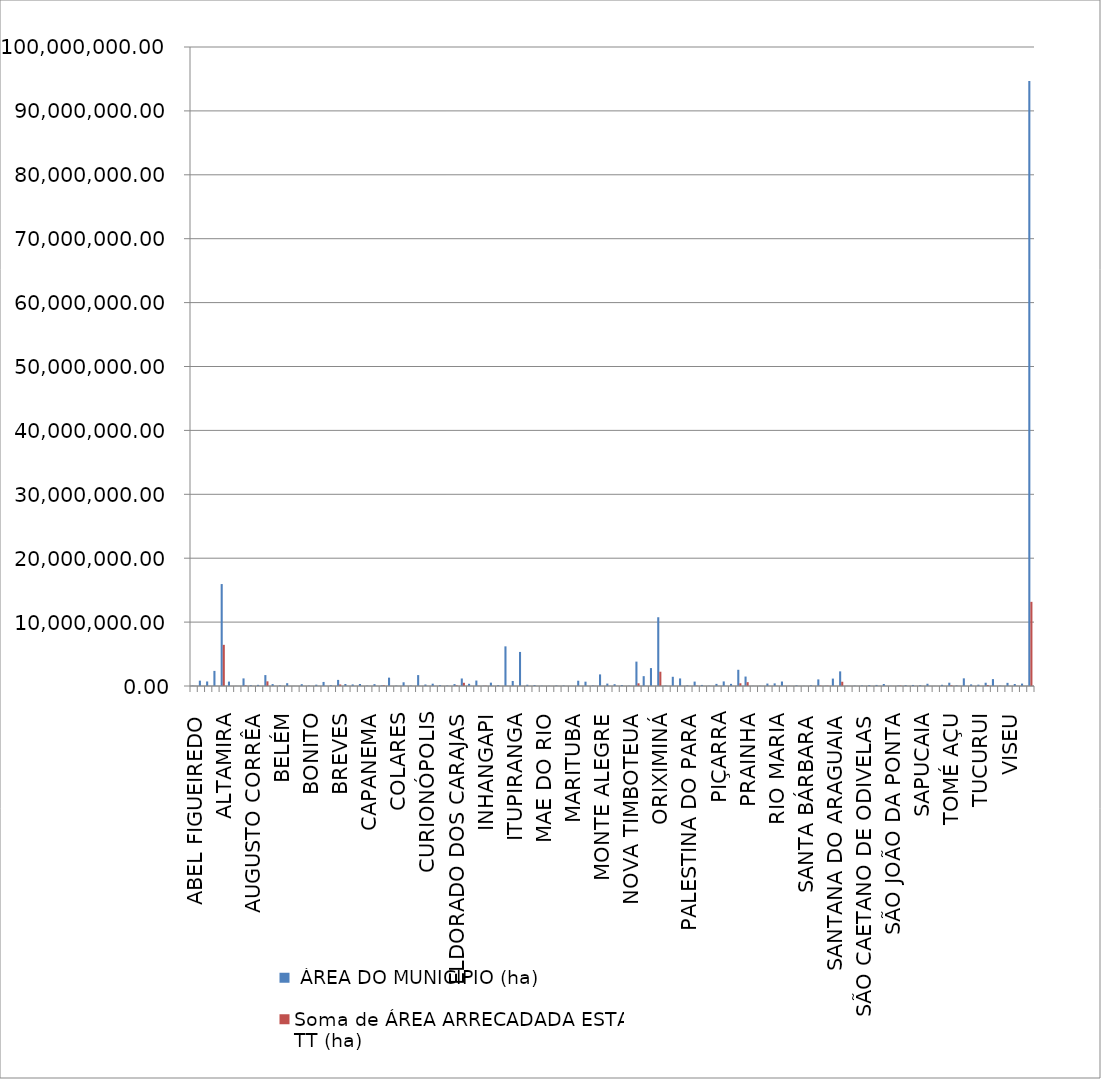
| Category |  ÁREA DO MUNICÍPIO (ha) | Soma de ÁREA ARRECADADA ESTADUAL TT (ha) |
|---|---|---|
| ABEL FIGUEIREDO | 61627.1 | 13182.172 |
| AFUÁ | 837279.5 | 0 |
| AGUA AZUL DO NORTE | 711396.1 | 0 |
| ALENQUER | 2364545.2 | 0 |
| ALTAMIRA | 15953373 | 6442000 |
| ANAJÁS | 692174.6 | 0 |
| ANANINDEUA | 19050.3 | 24.675 |
| ANAPU | 1189550.6 | 94958.828 |
| AUGUSTO CORRÊA | 109154.1 | 32.314 |
| AURORA DO PARA | 181184 | 0 |
| AVEIRO | 1707403.6 | 728844.291 |
| BANNACH | 295644.9 | 0 |
| BELÉM | 105940.6 | 9.077 |
| BELTERRA | 439841.9 | 0 |
| BENEVIDES | 18782.6 | 64.456 |
| BOM JESUS DO TOCANTINS | 281647.9 | 2923.709 |
| BONITO | 58673.7 | 98.203 |
| BRAGANÇA | 209193 | 537.041 |
| BRASIL NOVO | 636257.5 | 0 |
| BREJO GRANDE DO ARAGUAIA | 128847.7 | 0 |
| BREVES | 955051.3 | 240000 |
| CACHOEIRA DO ARARI | 310026.1 | 0 |
| CACHOEIRA DO PIRIÁ | 246197.2 | 0 |
| CANAÃ DOS CARAJÁS | 314640.7 | 0 |
| CAPANEMA | 61469.3 | 47.229 |
| CAPITÃO POÇO | 289955.3 | 0 |
| CASTANHAL | 102888.9 | 100324.492 |
| CHAVES | 1308495.7 | 0 |
| COLARES | 60979.2 | 0 |
| CONCEIÇÃO DO ARAGUAIA | 582948.2 | 715.307 |
| CONCORDIA DO PARA | 69094.7 | 0 |
| CUMARÚ DO NORTE | 1708500.1 | 153.968 |
| CURIONÓPOLIS | 236874.3 | 0 |
| CURRALINHO | 361725.2 | 0 |
| CURUÁ | 143115.7 | 0 |
| CURUÇA | 67267.5 | 43.261 |
| ELDORADO DOS CARAJAS | 295673.4 | 89729.162 |
| FARO | 1177062.8 | 503125 |
| FLORESTA DO ARAGUAIA | 344428.5 | 0 |
| GURUPÁ | 854011.3 | 24218.399 |
| INHANGAPI | 47144.9 | 43339.107 |
| IPIXUNA DO PARA | 521555.5 | 6702.169 |
| IRITUIA | 137936.2 | 0 |
| ITAITUBA | 6204070.5 | 0 |
| ITUPIRANGA | 788010.7 | 433.103 |
| JACAREACANGA | 5330308.3 | 0 |
| JACUNDÁ | 200831.5 | 0 |
| LIMOEIRO DO AJURÚ | 149018.6 | 0 |
| MAE DO RIO | 46949.2 | 0 |
| MAGALHAES BARATA | 32526.5 | 307.289 |
| MARACANÃ | 85566.4 | 9417.008 |
| MARAPANIM | 79598.7 | 4462.719 |
| MARITUBA | 10334.3 | 0.03 |
| MEDICILÂNDIA | 827262.9 | 0 |
| MELGAÇO | 677401.8 | 0 |
| MOCAJUBA | 87080.9 | 17991.442 |
| MONTE ALEGRE | 1815256 | 0 |
| MUANÁ | 376555 | 0 |
| NOVA ESPERANÇA DO PIRIA | 280931.2 | 0 |
| NOVA IPIXUNA | 156418.4 | 0 |
| NOVA TIMBOTEUA | 48985.2 | 128.933 |
| NOVO PROGRESSO | 3816213.4 | 420588.49 |
| NOVO REPARTIMENTO | 1539871.4 | 0 |
| ÓBIDOS | 2802141.9 | 0 |
| ORIXIMINÁ | 10760329.2 | 2235169.202 |
| OUREM | 56238.7 | 652.108 |
| OURILANDIA DO NORTE | 1441056.7 | 0 |
| PACAJÁ | 1183233.3 | 0 |
| PALESTINA DO PARA | 98436.2 | 0 |
| PARAUAPEBAS | 688620.8 | 45256.496 |
| PAU DÀRCO | 167141.9 | 0 |
| PEIXE BOI | 45022.2 | 0 |
| PIÇARRA | 331266.1 | 636.257 |
| PLACAS | 717319.4 | 0 |
| PONTA DE PEDRAS | 336514.8 | 0 |
| PORTEL | 2538496 | 430000 |
| PRAINHA | 1478698.7 | 601044.588 |
| PRIMAVERA | 25860 | 26.004 |
| QUATIPURU | 32611.3 | 0 |
| REDENÇÃO | 382380.9 | 4339.96 |
| RIO MARIA | 411461 | 0 |
| RURÓPOLIS | 702132.1 | 0 |
| SALINÓPOLIS | 23773.8 | 316.704 |
| SALVATERRA | 103907.2 | 0 |
| SANTA BÁRBARA | 27815.4 | 1736.754 |
| SANTA CRUZ DO ARARI | 107665.2 | 0 |
| SANTA MARIA DAS BARREIRAS | 1033021.4 | 53743.17 |
| SANTA MARIA DO PARÁ | 45772.5 | 46868.015 |
| SANTANA DO ARAGUAIA | 1159156.3 | 0 |
| SANTARÉM | 2288662.4 | 666504.214 |
| SANTAREM NOVO | 22951 | 0 |
| SANTO ANTONIO DO TAUÁ | 53762.5 | 1448.103 |
| SÃO CAETANO DE ODIVELAS | 74346.6 | 264.616 |
| SÃO DOMINGOS DO ARAGUAIA | 139246.4 | 0 |
| SÃO DOMINGOS DO CAPIM | 167724.9 | 2422.609 |
| SÃO GERALDO DO ARAGUAIA | 316838.3 | 0 |
| SÃO JOÃO DA PONTA | 19591.8 | 7136.436 |
| SÃO JOÃO DE PIRABAS | 70554.2 | 60960.959 |
| SÃO JOÃO DO ARAGUAIA | 127988.9 | 0 |
| SÃO SEBASTIAO DA BOA VISTA | 163225.1 | 0 |
| SAPUCAIA | 129819 | 0 |
| SOURE | 351731.8 | 0 |
| TERRA ALTA | 20641.4 | 0 |
| TERRA SANTA | 189650.6 | 0 |
| TOMÉ AÇU | 514536.1 | 102907.22 |
| TRACUATEUA | 93427.2 | 10890.425 |
| TRAIRÃO | 1199108.5 | 0 |
| TUCUMÃ | 251259.4 | 0 |
| TUCURUI | 208618.9 | 0 |
| ULIANÓPOLIS | 508846.8 | 152654.04 |
| URUARÁ | 1079137.1 | 0 |
| VIGIA | 53907.9 | 572.898 |
| VISEU | 491507.3 | 436.081 |
| VITORIA DO XINGÚ | 308953.7 | 0 |
| XINGUARA | 377935.9 | 0 |
| Total Geral | 94675847.5 | 13170388.735 |